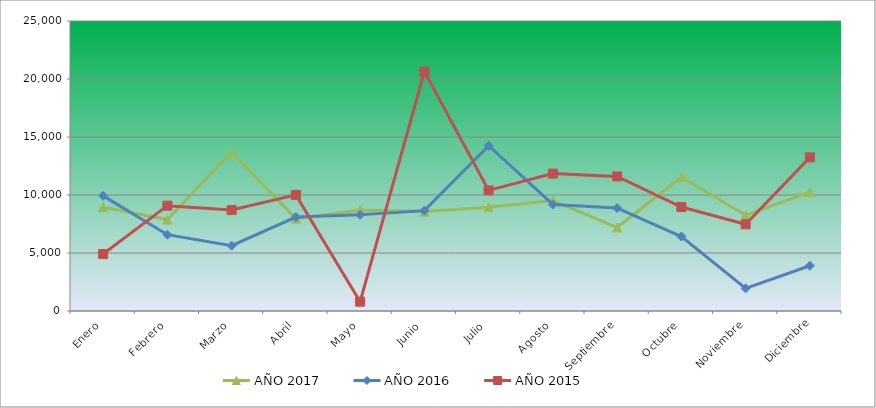
| Category | AÑO 2017 | AÑO 2016 | AÑO 2015 |
|---|---|---|---|
| Enero | 8950.014 | 9926.339 | 4908.44 |
| Febrero | 7880 | 6579.327 | 9080 |
| Marzo | 13688.582 | 5634.011 | 8700 |
| Abril | 7960.19 | 8100 | 10007.894 |
| Mayo | 8702.327 | 8291.06 | 805.202 |
| Junio | 8569.288 | 8649.724 | 20640 |
| Julio | 8953.992 | 14249.029 | 10400 |
| Agosto | 9527.716 | 9185.682 | 11845.809 |
| Septiembre | 7195.037 | 8875.032 | 11602.194 |
| Octubre | 11540 | 6420 | 8961.339 |
| Noviembre | 8260.148 | 1950.646 | 7474.95 |
| Diciembre | 10257.772 | 3900 | 13244.212 |